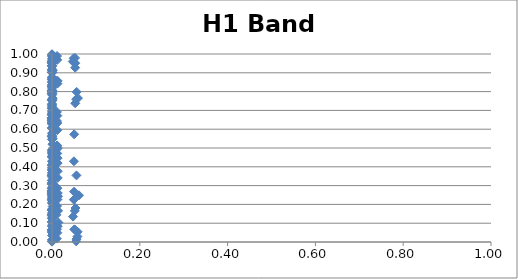
| Category | H1 Band 1 |
|---|---|
| 2.1234767190230094e-10 | 0.428 |
| 2.1823215421288188e-10 | 0.661 |
| 2.456668731822884e-10 | 0.002 |
| 2.4958728359406744e-10 | 0.567 |
| 2.524520583579849e-10 | 0.608 |
| 2.564782472251878e-10 | 0.819 |
| 2.870732689011217e-10 | 0.953 |
| 2.885965554783698e-10 | 0.41 |
| 2.9653796850900167e-10 | 0.326 |
| 3.3178842842110586e-10 | 0.853 |
| 3.3704681758625977e-10 | 0.406 |
| 3.893393559864688e-10 | 0.246 |
| 1.2585277097562478e-08 | 0.865 |
| 1.2900032388252745e-08 | 0.085 |
| 1.3223297873098933e-08 | 0.065 |
| 1.3553554375008077e-08 | 0.141 |
| 1.4356809921003133e-08 | 0.913 |
| 1.4563627409916188e-08 | 0.903 |
| 1.4714552239303248e-08 | 0.258 |
| 1.4926377636556912e-08 | 0.791 |
| 1.508193313565005e-08 | 0.8 |
| 1.5298897629811785e-08 | 0.146 |
| 1.545722449196362e-08 | 0.655 |
| 1.5679434919269443e-08 | 0.656 |
| 1.6525656855001448e-08 | 0.261 |
| 1.6604825753960116e-08 | 0.455 |
| 1.7016893079949853e-08 | 0.956 |
| 1.7356982117070712e-08 | 0.126 |
| 1.744001937821129e-08 | 0.759 |
| 1.7872212247342826e-08 | 0.939 |
| 1.883316387776934e-08 | 0.471 |
| 1.9102404356092215e-08 | 0.678 |
| 1.9777019070746364e-08 | 0.788 |
| 2.0059361231105254e-08 | 0.328 |
| 2.1758160864438958e-08 | 0.675 |
| 2.2844060947465533e-08 | 0.652 |
| 2.962953792870785e-07 | 0.959 |
| 2.9914148461965643e-07 | 0.256 |
| 3.030237865761576e-07 | 0.867 |
| 3.0593233696316057e-07 | 0.105 |
| 3.339704131807069e-07 | 0.999 |
| 3.3716555028355905e-07 | 0.902 |
| 3.3833927319173687e-07 | 0.127 |
| 3.415237559408568e-07 | 0.967 |
| 3.4157478989468423e-07 | 0.263 |
| 3.4478869366710227e-07 | 0.451 |
| 3.4598805156196545e-07 | 0.8 |
| 3.4929421769274587e-07 | 0.791 |
| 3.7950698414280907e-07 | 0.661 |
| 3.8115807225130017e-07 | 0.561 |
| 3.8312210460805484e-07 | 0.14 |
| 3.847883849843472e-07 | 0.359 |
| 3.897399210303014e-07 | 0.834 |
| 3.9344916017753127e-07 | 0.22 |
| 4.273387489324025e-07 | 0.291 |
| 4.3139305175869927e-07 | 0.936 |
| 4.3288230333119326e-07 | 0.168 |
| 4.36987385794526e-07 | 0.356 |
| 4.871827784615834e-07 | 0.174 |
| 4.917840411651853e-07 | 0.934 |
| 5.158962842546905e-07 | 0.826 |
| 5.273908661378575e-07 | 0.067 |
| 5.801973006099032e-07 | 0.874 |
| 5.876443763341788e-07 | 0.228 |
| 5.930714119427855e-07 | 0.267 |
| 6.006778745503318e-07 | 0.173 |
| 6.577298205096262e-07 | 0.805 |
| 6.605375070208675e-07 | 0.727 |
| 6.751272164192693e-07 | 0.953 |
| 7.389758113266109e-07 | 0.606 |
| 7.483801208181899e-07 | 0.252 |
| 8.403777160192567e-07 | 0.307 |
| 8.168316353291611e-06 | 0.312 |
| 8.237543187333576e-06 | 0.346 |
| 8.331844850307904e-06 | 0.684 |
| 8.402397568946187e-06 | 0.239 |
| 8.498948040573692e-06 | 0.061 |
| 8.570854370742046e-06 | 0.252 |
| 8.668804359627521e-06 | 0.918 |
| 8.74208532557326e-06 | 0.709 |
| 9.078450680558126e-06 | 0.631 |
| 9.155041731903718e-06 | 0.808 |
| 9.183154892721936e-06 | 0.224 |
| 9.25937014669387e-06 | 0.992 |
| 9.260590849672614e-06 | 0.603 |
| 9.337420832848237e-06 | 0.367 |
| 9.366069614949815e-06 | 0.003 |
| 9.444227167936512e-06 | 0.316 |
| 9.444980505779504e-06 | 0.148 |
| 9.523767866033207e-06 | 0.648 |
| 9.552963413550078e-06 | 0.996 |
| 9.632112238516318e-06 | 0.734 |
| 9.633379917639643e-06 | 0.636 |
| 9.713165942292591e-06 | 0.679 |
| 9.742916689886628e-06 | 0.663 |
| 9.824862025331277e-06 | 0.904 |
| 1.016197544449026e-05 | 0.168 |
| 1.0200951752832855e-05 | 0.035 |
| 1.0247288593686599e-05 | 0.107 |
| 1.0286577799517056e-05 | 0.409 |
| 1.0403207174730093e-05 | 0.848 |
| 1.0490455995197467e-05 | 0.397 |
| 1.0569373670954163e-05 | 0.283 |
| 1.0609843058416983e-05 | 0.38 |
| 1.0657954581693425e-05 | 0.754 |
| 1.069874824385099e-05 | 0.692 |
| 1.0819841937779522e-05 | 0.71 |
| 1.0910428865148664e-05 | 0.48 |
| 1.1283055302197367e-05 | 0.154 |
| 1.1377346309905233e-05 | 0.635 |
| 1.1411954388964274e-05 | 0.491 |
| 1.1507274824080777e-05 | 0.96 |
| 1.1733292285498697e-05 | 0.804 |
| 1.1831176597832995e-05 | 0.106 |
| 1.1867103178719244e-05 | 0.949 |
| 1.1966054131065482e-05 | 0.272 |
| 1.2664212741042147e-05 | 0.756 |
| 1.2769505812179599e-05 | 0.012 |
| 1.3166942836957334e-05 | 0.268 |
| 1.3276225776885104e-05 | 0.835 |
| 0.00010078741003635494 | 0.628 |
| 0.00010257360776560601 | 0.354 |
| 0.00011067686671965149 | 0.804 |
| 0.00011180675246643151 | 0.563 |
| 0.00011262823636286894 | 0.938 |
| 0.00011377693385019935 | 0.662 |
| 0.00012229719423028143 | 0.642 |
| 0.00012271232885843365 | 0.051 |
| 0.00012486349102413654 | 0.208 |
| 0.00013210220689575646 | 0.877 |
| 0.00013416413977041425 | 0.085 |
| 0.00013551918064536573 | 0.647 |
| 0.00014486286270495028 | 0.307 |
| 0.0001463196175609976 | 0.546 |
| 0.0001485902518405211 | 0.388 |
| 0.00015423402247686702 | 0.72 |
| 0.00015536475922298262 | 0.055 |
| 0.0001569029090660761 | 0.273 |
| 0.00015711821260880348 | 0.698 |
| 0.00015805208311582772 | 0.172 |
| 0.00015983411047032852 | 0.827 |
| 0.00016036852775085997 | 0.578 |
| 0.00016899642213121302 | 0.487 |
| 0.0001702288933191096 | 0.975 |
| 0.00017068091116004505 | 0.309 |
| 0.00017190535384682088 | 0.231 |
| 0.00017192495349044014 | 0.477 |
| 0.000172140010254623 | 0.328 |
| 0.0001731578025000386 | 0.863 |
| 0.0001736171448556469 | 0.733 |
| 0.00017385400233146334 | 0.986 |
| 0.00017488133917184086 | 0.9 |
| 0.00017509987862937736 | 0.919 |
| 0.00017684161747491783 | 0.352 |
| 0.00018630090356949708 | 0.386 |
| 0.0001869183213392837 | 0.645 |
| 0.0001876518988364364 | 0.313 |
| 0.00018827353180017045 | 0.369 |
| 0.00019011685065862665 | 0.283 |
| 0.00019037485358670863 | 0.272 |
| 0.00019149388333101173 | 0.559 |
| 0.0001936290210585602 | 0.715 |
| 0.00020393025979587235 | 0.793 |
| 0.00020540126274414517 | 0.751 |
| 0.00020594073307812606 | 0.066 |
| 0.00020742537710504122 | 0.783 |
| 0.00022530901047051278 | 0.003 |
| 0.0002269246262083097 | 0.209 |
| 0.0012909806634268117 | 0.234 |
| 0.0013104059790640687 | 0.46 |
| 0.0013301535400527089 | 0.313 |
| 0.0013501229074871421 | 0.138 |
| 0.0013978687045086333 | 0.952 |
| 0.0014099811686791091 | 0.912 |
| 0.0014187752138500186 | 0.521 |
| 0.0014310548764355294 | 0.007 |
| 0.0014400264884734239 | 0.051 |
| 0.0014524758815815466 | 0.692 |
| 0.0014615143847470883 | 0.839 |
| 0.0014741351705690152 | 0.013 |
| 0.0015215304335350788 | 0.857 |
| 0.0015259122221885034 | 0.433 |
| 0.0015485798687124859 | 0.765 |
| 0.0015671160807445791 | 0.55 |
| 0.0015716188547498168 | 0.189 |
| 0.0015949118717146502 | 0.241 |
| 0.0016458743404557826 | 0.138 |
| 0.001659956641392135 | 0.467 |
| 0.001694881189109842 | 0.519 |
| 0.001709349415770434 | 0.582 |
| 0.001794660771524913 | 0.093 |
| 0.001847730105941138 | 0.047 |
| 0.009984454081129612 | 0.144 |
| 0.010037427237062533 | 0.45 |
| 0.010667320288995207 | 0.418 |
| 0.010723507396918032 | 0.857 |
| 0.010744083903059806 | 0.226 |
| 0.010800630509623637 | 0.018 |
| 0.01121560143118987 | 0.692 |
| 0.011306021782250463 | 0.287 |
| 0.011354052069222687 | 0.643 |
| 0.01136518939800352 | 0.068 |
| 0.011445462918333567 | 0.514 |
| 0.011472815165988042 | 0.511 |
| 0.011505278075695782 | 0.989 |
| 0.011532757212461456 | 0.192 |
| 0.01197256897235269 | 0.471 |
| 0.0120576187952362 | 0.049 |
| 0.012068384357979405 | 0.969 |
| 0.012119277892294405 | 0.286 |
| 0.01213107890453863 | 0.164 |
| 0.012154037273891662 | 0.595 |
| 0.012205250870732992 | 0.632 |
| 0.01221613321956823 | 0.672 |
| 0.01221712607051357 | 0.502 |
| 0.012279507588326842 | 0.226 |
| 0.012302714778584519 | 0.496 |
| 0.0123664869799283 | 0.842 |
| 0.012834313919855315 | 0.42 |
| 0.012864589249571977 | 0.446 |
| 0.012966700325791057 | 0.857 |
| 0.013020934894183002 | 0.341 |
| 0.013033510317392224 | 0.084 |
| 0.013124142816255922 | 0.26 |
| 0.013191669778072884 | 0.377 |
| 0.013686954525415494 | 0.243 |
| 0.013782695628377545 | 0.166 |
| 0.0146905456387362 | 0.103 |
| 0.047370274794604386 | 0.96 |
| 0.04785159386174785 | 0.135 |
| 0.04929249002107264 | 0.977 |
| 0.04979004416656974 | 0.225 |
| 0.04998773723249543 | 0.429 |
| 0.05027971197334634 | 0.268 |
| 0.05049112695872016 | 0.573 |
| 0.05078554670805108 | 0.067 |
| 0.05199778330887759 | 0.166 |
| 0.05229948692312298 | 0.066 |
| 0.05251793800924415 | 0.979 |
| 0.05282214457087702 | 0.927 |
| 0.052927264588090696 | 0.951 |
| 0.053029795205902994 | 0.738 |
| 0.05355849722431441 | 0.181 |
| 0.055034648582009286 | 0.76 |
| 0.05514055024077493 | 0.004 |
| 0.055686609797058945 | 0.354 |
| 0.0557964296351573 | 0.015 |
| 0.05611627721968993 | 0.798 |
| 0.05799755116743158 | 0.029 |
| 0.05832777293313517 | 0.055 |
| 0.05912694049708494 | 0.766 |
| 0.06143536575637108 | 0.248 |